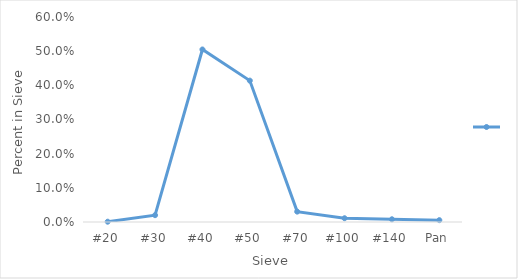
| Category | Series 0 |
|---|---|
| #20 | 0.001 |
| #30 | 0.02 |
| #40 | 0.505 |
| #50 | 0.414 |
| #70 | 0.03 |
| #100 | 0.011 |
| #140 | 0.008 |
| Pan | 0.005 |